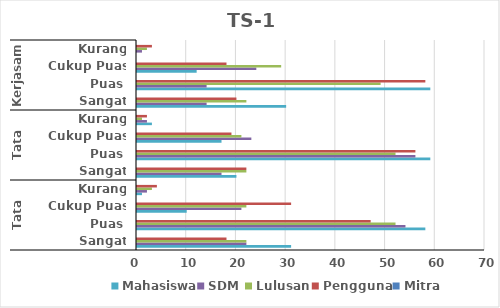
| Category | Mahasiswa | SDM | Lulusan | Pengguna | Mitra |
|---|---|---|---|---|---|
| 0 | 31 | 22 | 22 | 18 | 0 |
| 1 | 58 | 54 | 52 | 47 | 0 |
| 2 | 10 | 21 | 22 | 31 | 0 |
| 3 | 1 | 2 | 3 | 4 | 0 |
| 4 | 20 | 17 | 22 | 22 | 0 |
| 5 | 59 | 56 | 52 | 56 | 0 |
| 6 | 17 | 23 | 21 | 19 | 0 |
| 7 | 3 | 2 | 1 | 2 | 0 |
| 8 | 30 | 14 | 22 | 20 | 0 |
| 9 | 59 | 14 | 49 | 58 | 0 |
| 10 | 12 | 24 | 29 | 18 | 0 |
| 11 | 0 | 1 | 2 | 3 | 0 |